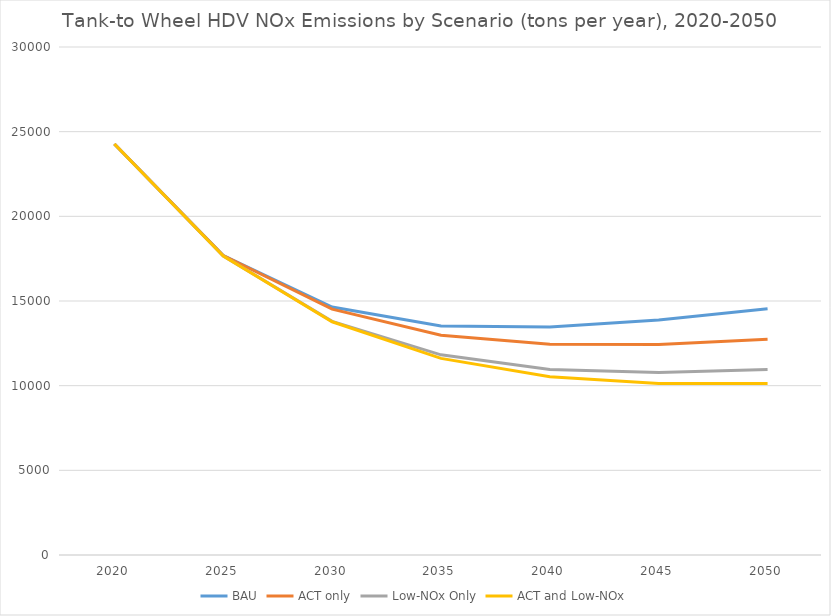
| Category | BAU | ACT only | Low-NOx Only | ACT and Low-NOx |
|---|---|---|---|---|
| 2020.0 | 24269.542 | 24269.542 | 24269.542 | 24269.542 |
| 2025.0 | 17679.519 | 17679.519 | 17656.505 | 17657.768 |
| 2030.0 | 14640.833 | 14522.221 | 13796.389 | 13772.791 |
| 2035.0 | 13527.06 | 12982.009 | 11820.355 | 11609.958 |
| 2040.0 | 13458.425 | 12453.059 | 10956.136 | 10527.748 |
| 2045.0 | 13874.766 | 12433.325 | 10775.518 | 10124.656 |
| 2050.0 | 14538.66 | 12734.029 | 10962.034 | 10126.232 |